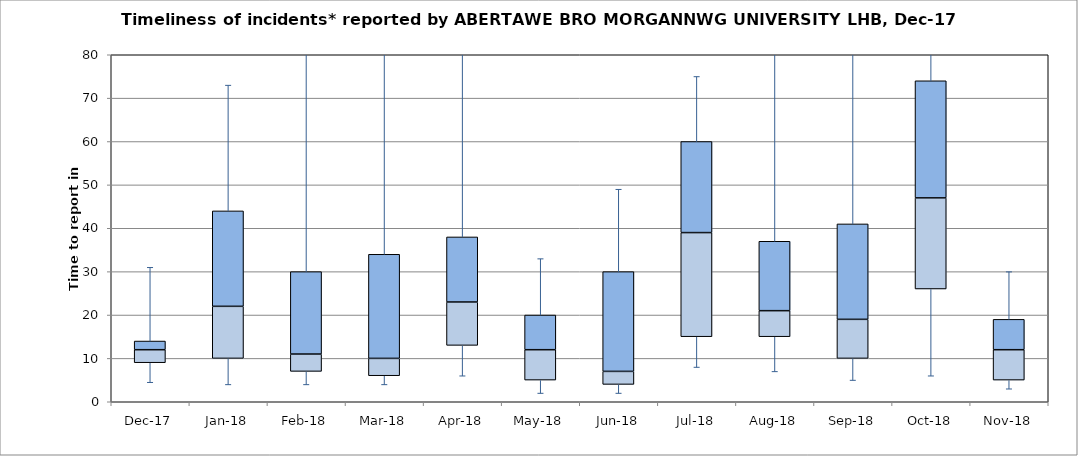
| Category | Series 0 | Series 1 | Series 2 |
|---|---|---|---|
| Dec-17 | 9 | 3 | 2 |
| Jan-18 | 10 | 12 | 22 |
| Feb-18 | 7 | 4 | 19 |
| Mar-18 | 6 | 4 | 24 |
| Apr-18 | 13 | 10 | 15 |
| May-18 | 5 | 7 | 8 |
| Jun-18 | 4 | 3 | 23 |
| Jul-18 | 15 | 24 | 21 |
| Aug-18 | 15 | 6 | 16 |
| Sep-18 | 10 | 9 | 22 |
| Oct-18 | 26 | 21 | 27 |
| Nov-18 | 5 | 7 | 7 |